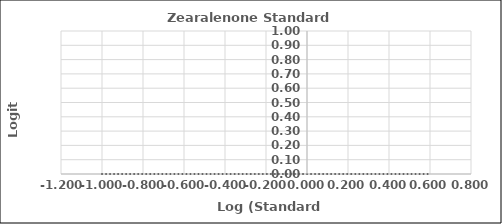
| Category | Series 0 |
|---|---|
| -1.0 | 0 |
| -0.5228787452803376 | 0 |
| -0.2218487496163564 | 0 |
| 0.07918124604762482 | 0 |
| 0.6020599913279624 | 0 |